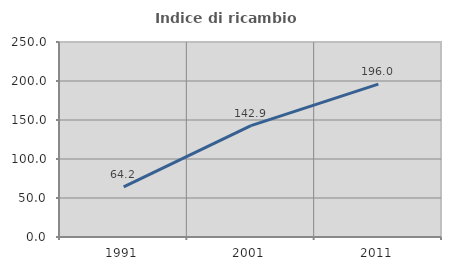
| Category | Indice di ricambio occupazionale  |
|---|---|
| 1991.0 | 64.234 |
| 2001.0 | 142.857 |
| 2011.0 | 196 |